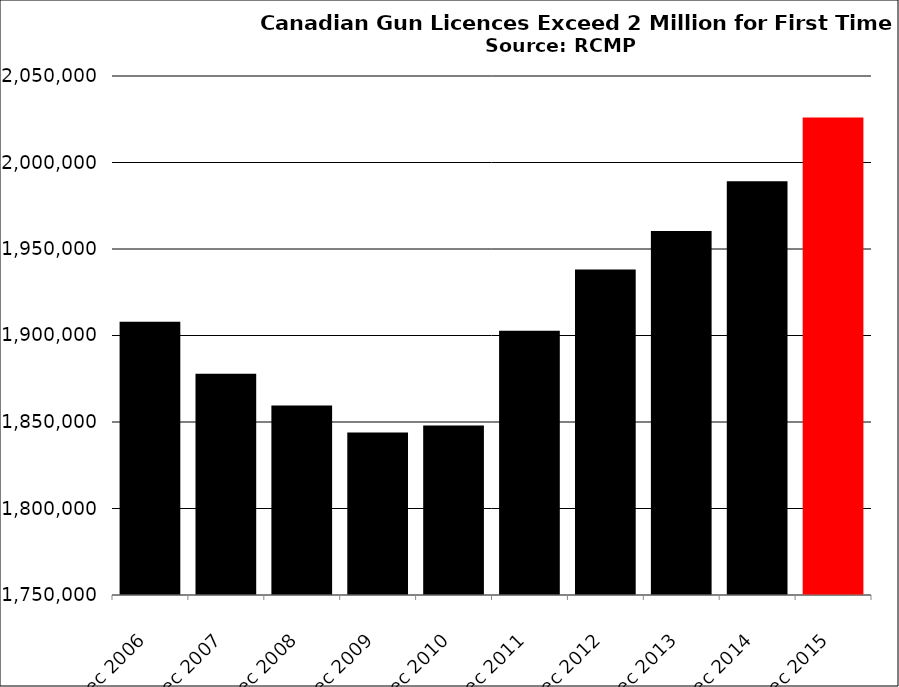
| Category | Series 13 |
|---|---|
| 2006-12-31 | 1908011 |
| 2007-12-31 | 1877880 |
| 2008-12-31 | 1859501 |
| 2009-12-31 | 1843913 |
| 2010-12-31 | 1848000 |
| 2011-12-31 | 1902815 |
| 2012-12-31 | 1938080 |
| 2013-12-31 | 1960380 |
| 2014-12-31 | 1989181 |
| 2015-12-31 | 2026011 |